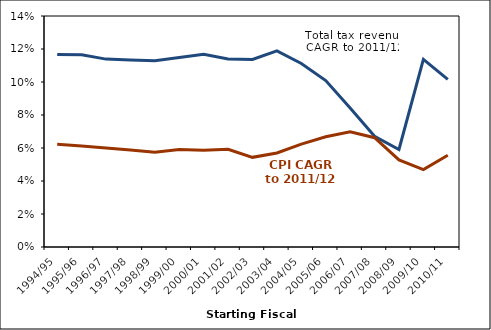
| Category | Total tax revenue CAGR to 2011/12 | CPI CAGR to 2011/12 |
|---|---|---|
| 1994/95 | 0.117 | 0.062 |
| 1995/96 | 0.117 | 0.061 |
| 1996/97 | 0.114 | 0.06 |
| 1997/98 | 0.113 | 0.059 |
| 1998/99 | 0.113 | 0.057 |
| 1999/00 | 0.115 | 0.059 |
| 2000/01 | 0.117 | 0.059 |
| 2001/02 | 0.114 | 0.059 |
| 2002/03 | 0.114 | 0.054 |
| 2003/04 | 0.119 | 0.057 |
| 2004/05 | 0.111 | 0.062 |
| 2005/06 | 0.101 | 0.067 |
| 2006/07 | 0.084 | 0.07 |
| 2007/08 | 0.067 | 0.066 |
| 2008/09 | 0.059 | 0.053 |
| 2009/10 | 0.114 | 0.047 |
| 2010/11 | 0.102 | 0.056 |